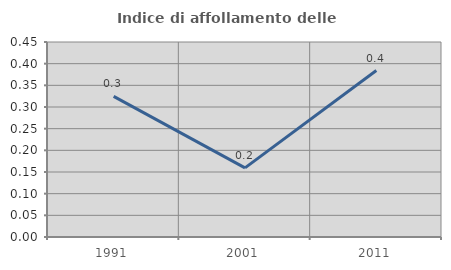
| Category | Indice di affollamento delle abitazioni  |
|---|---|
| 1991.0 | 0.324 |
| 2001.0 | 0.159 |
| 2011.0 | 0.384 |